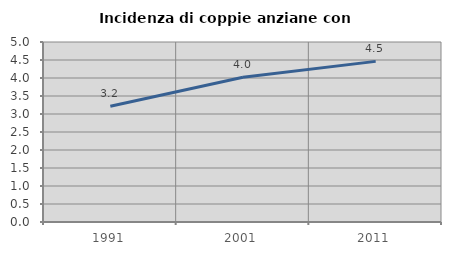
| Category | Incidenza di coppie anziane con figli |
|---|---|
| 1991.0 | 3.216 |
| 2001.0 | 4.021 |
| 2011.0 | 4.462 |